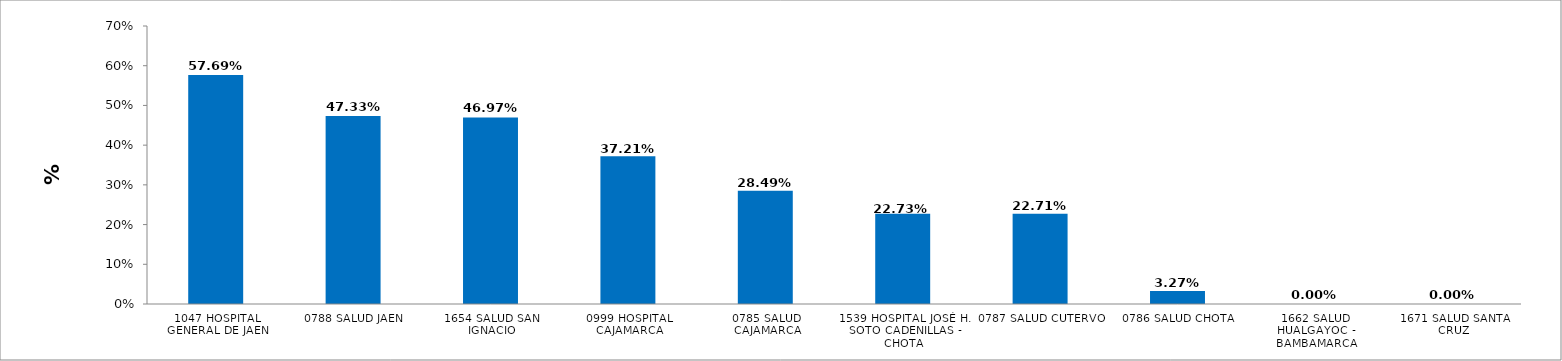
| Category | UNIDAD EJECUTORA |
|---|---|
| 1047 HOSPITAL GENERAL DE JAEN | 0.577 |
| 0788 SALUD JAEN | 0.473 |
| 1654 SALUD SAN IGNACIO | 0.47 |
| 0999 HOSPITAL CAJAMARCA | 0.372 |
| 0785 SALUD CAJAMARCA | 0.285 |
| 1539 HOSPITAL JOSÉ H. SOTO CADENILLAS - CHOTA | 0.227 |
| 0787 SALUD CUTERVO | 0.227 |
| 0786 SALUD CHOTA | 0.033 |
| 1662 SALUD HUALGAYOC - BAMBAMARCA | 0 |
| 1671 SALUD SANTA CRUZ | 0 |